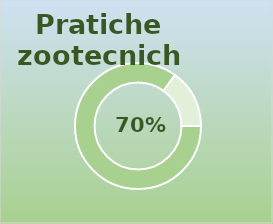
| Category | Series 0 |
|---|---|
| 0 | 1.7 |
| 1 | 0.3 |